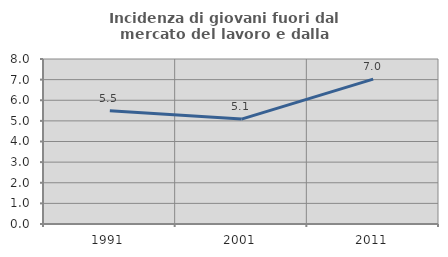
| Category | Incidenza di giovani fuori dal mercato del lavoro e dalla formazione  |
|---|---|
| 1991.0 | 5.491 |
| 2001.0 | 5.087 |
| 2011.0 | 7.024 |